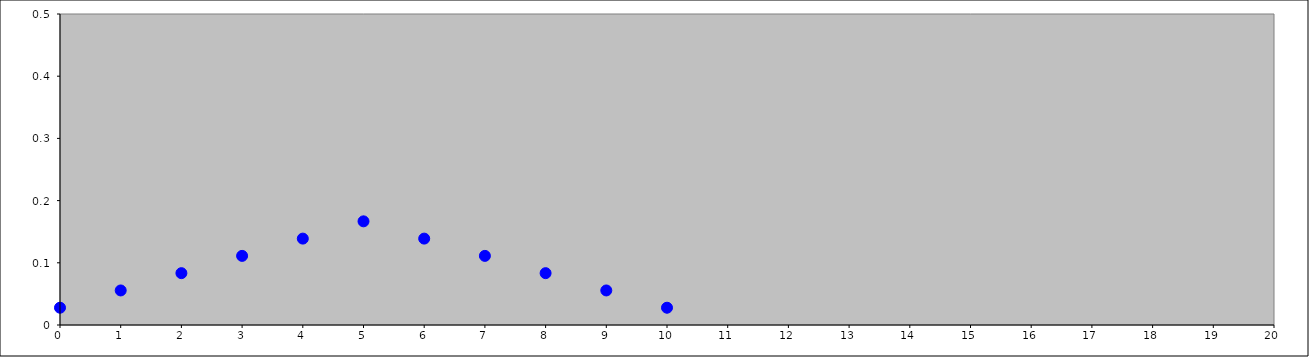
| Category | Series 0 |
|---|---|
| 0.0 | 0.028 |
| 1.0 | 0.056 |
| 2.0 | 0.083 |
| 3.0 | 0.111 |
| 4.0 | 0.139 |
| 5.0 | 0.167 |
| 6.0 | 0.139 |
| 7.0 | 0.111 |
| 8.0 | 0.083 |
| 9.0 | 0.056 |
| 10.0 | 0.028 |